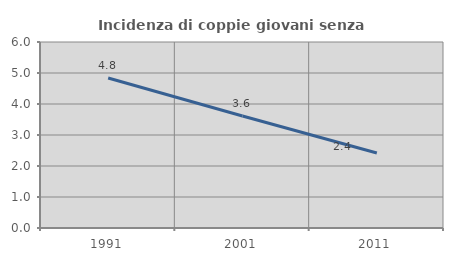
| Category | Incidenza di coppie giovani senza figli |
|---|---|
| 1991.0 | 4.837 |
| 2001.0 | 3.614 |
| 2011.0 | 2.419 |